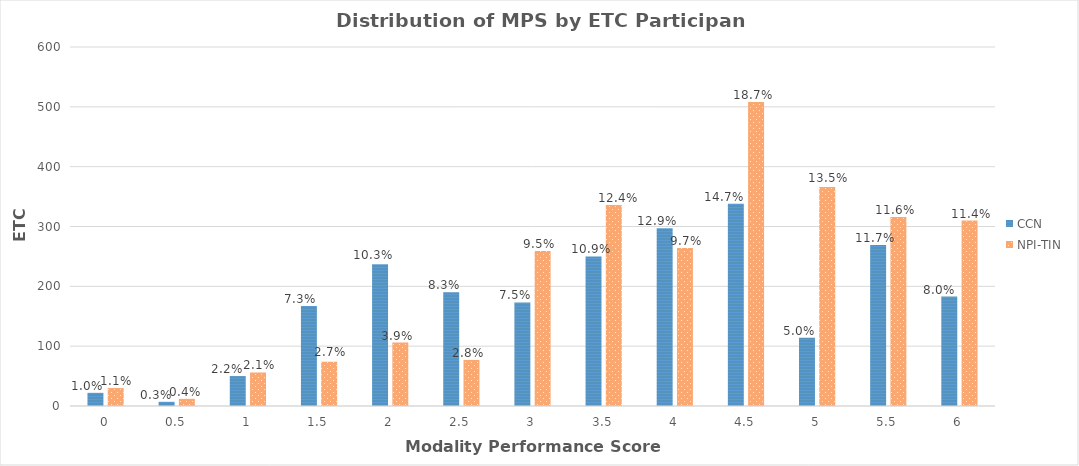
| Category | CCN | NPI-TIN |
|---|---|---|
| 0.0 | 22 | 30 |
| 0.5 | 7 | 12 |
| 1.0 | 50 | 56 |
| 1.5 | 167 | 74 |
| 2.0 | 237 | 106 |
| 2.5 | 190 | 77 |
| 3.0 | 173 | 259 |
| 3.5 | 250 | 336 |
| 4.0 | 297 | 264 |
| 4.5 | 338 | 508 |
| 5.0 | 114 | 366 |
| 5.5 | 269 | 316 |
| 6.0 | 183 | 310 |